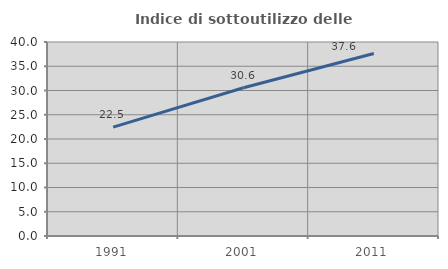
| Category | Indice di sottoutilizzo delle abitazioni  |
|---|---|
| 1991.0 | 22.454 |
| 2001.0 | 30.556 |
| 2011.0 | 37.632 |